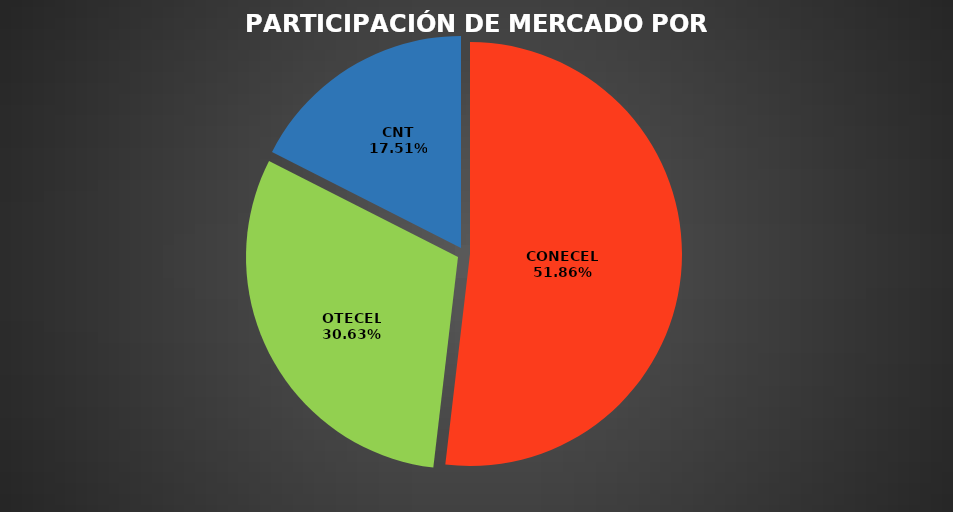
| Category | Jul 2023 |
|---|---|
| CONECEL | 9310350 |
| OTECEL | 5499232 |
| CNT | 3144067 |